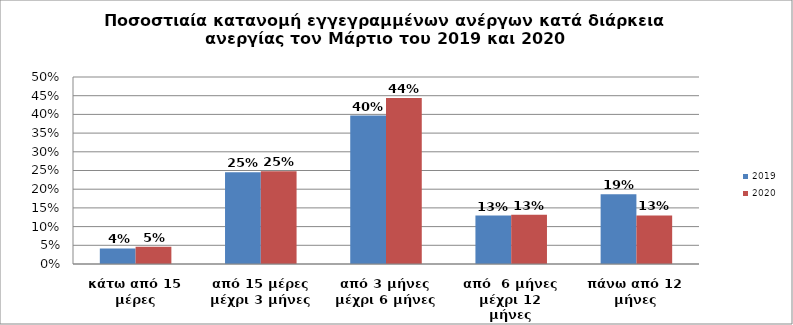
| Category | 2019 | 2020 |
|---|---|---|
| κάτω από 15 μέρες | 0.042 | 0.046 |
| από 15 μέρες μέχρι 3 μήνες | 0.245 | 0.248 |
| από 3 μήνες μέχρι 6 μήνες | 0.397 | 0.444 |
| από  6 μήνες μέχρι 12 μήνες | 0.13 | 0.132 |
| πάνω από 12 μήνες | 0.187 | 0.13 |